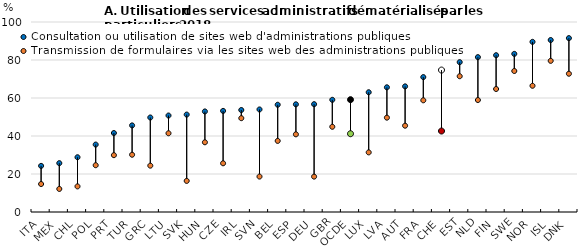
| Category | Consultation ou utilisation de sites web d'administrations publiques | Transmission de formulaires via les sites web des administrations publiques |
|---|---|---|
| ITA | 24.276 | 14.722 |
| MEX | 25.713 | 12.135 |
| CHL | 28.82 | 13.477 |
| POL | 35.495 | 24.619 |
| PRT | 41.569 | 29.912 |
| TUR | 45.581 | 30.138 |
| GRC | 49.745 | 24.389 |
| LTU | 50.782 | 41.445 |
| SVK | 51.276 | 16.365 |
| HUN | 52.934 | 36.691 |
| CZE | 53.214 | 25.636 |
| IRL | 53.682 | 49.381 |
| SVN | 53.975 | 18.653 |
| BEL | 56.448 | 37.421 |
| ESP | 56.678 | 40.879 |
| DEU | 56.749 | 18.617 |
| GBR | 59.046 | 44.85 |
| OCDE | 59.124 | 41.2 |
| LUX | 63.032 | 31.378 |
| LVA | 65.632 | 49.649 |
| AUT | 66.122 | 45.426 |
| FRA | 71.01 | 58.784 |
| CHE | 74.704 | 42.622 |
| EST | 78.867 | 71.456 |
| NLD | 81.508 | 58.926 |
| FIN | 82.521 | 64.735 |
| SWE | 83.229 | 74.211 |
| NOR | 89.566 | 66.435 |
| ISL | 90.517 | 79.553 |
| DNK | 91.518 | 72.772 |